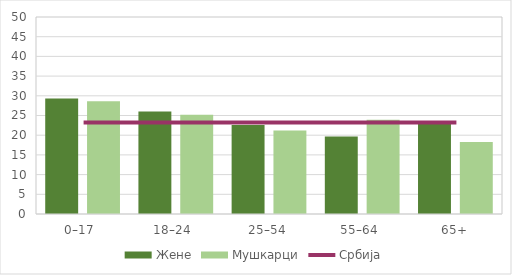
| Category | Жене | Мушкарци |
|---|---|---|
| 0–17  | 29.3 | 28.6 |
| 18–24  | 26 | 25.2 |
| 25–54 | 22.6 | 21.2 |
| 55–64  | 19.7 | 23.9 |
| 65+ | 23.2 | 18.3 |